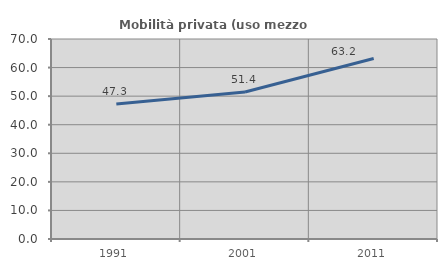
| Category | Mobilità privata (uso mezzo privato) |
|---|---|
| 1991.0 | 47.283 |
| 2001.0 | 51.445 |
| 2011.0 | 63.19 |